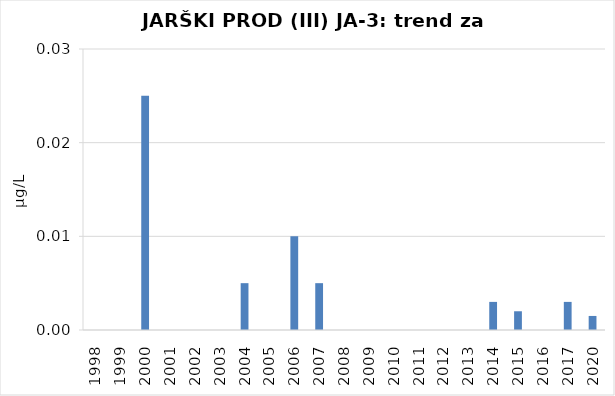
| Category | Vsota |
|---|---|
| 1998 | 0 |
| 1999 | 0 |
| 2000 | 0.025 |
| 2001 | 0 |
| 2002 | 0 |
| 2003 | 0 |
| 2004 | 0.005 |
| 2005 | 0 |
| 2006 | 0.01 |
| 2007 | 0.005 |
| 2008 | 0 |
| 2009 | 0 |
| 2010 | 0 |
| 2011 | 0 |
| 2012 | 0 |
| 2013 | 0 |
| 2014 | 0.003 |
| 2015 | 0.002 |
| 2016 | 0 |
| 2017 | 0.003 |
| 2020 | 0.002 |